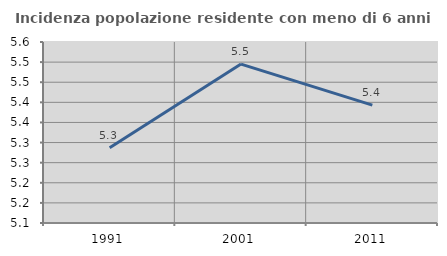
| Category | Incidenza popolazione residente con meno di 6 anni |
|---|---|
| 1991.0 | 5.287 |
| 2001.0 | 5.495 |
| 2011.0 | 5.393 |